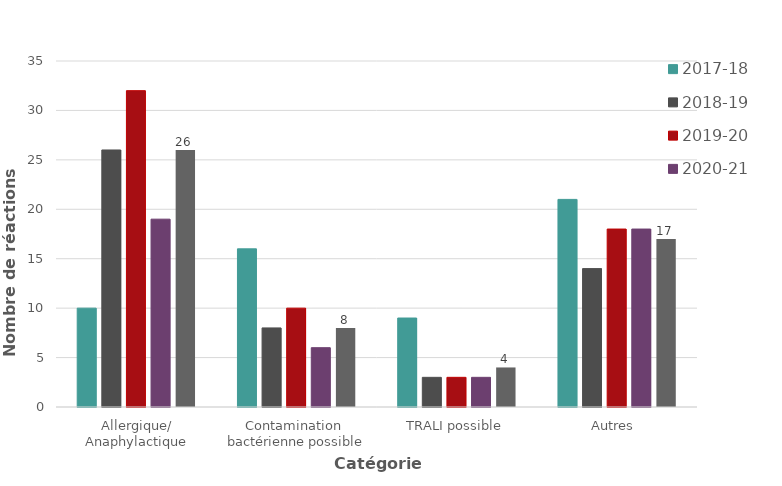
| Category | 2017-18 | 2018-19 | 2019-20 | 2020-21 | 2021-22 |
|---|---|---|---|---|---|
| Allergique/
Anaphylactique | 10 | 26 | 32 | 19 | 26 |
| Contamination 
bactérienne possible | 16 | 8 | 10 | 6 | 8 |
| TRALI possible | 9 | 3 | 3 | 3 | 4 |
| Autres  | 21 | 14 | 18 | 18 | 17 |